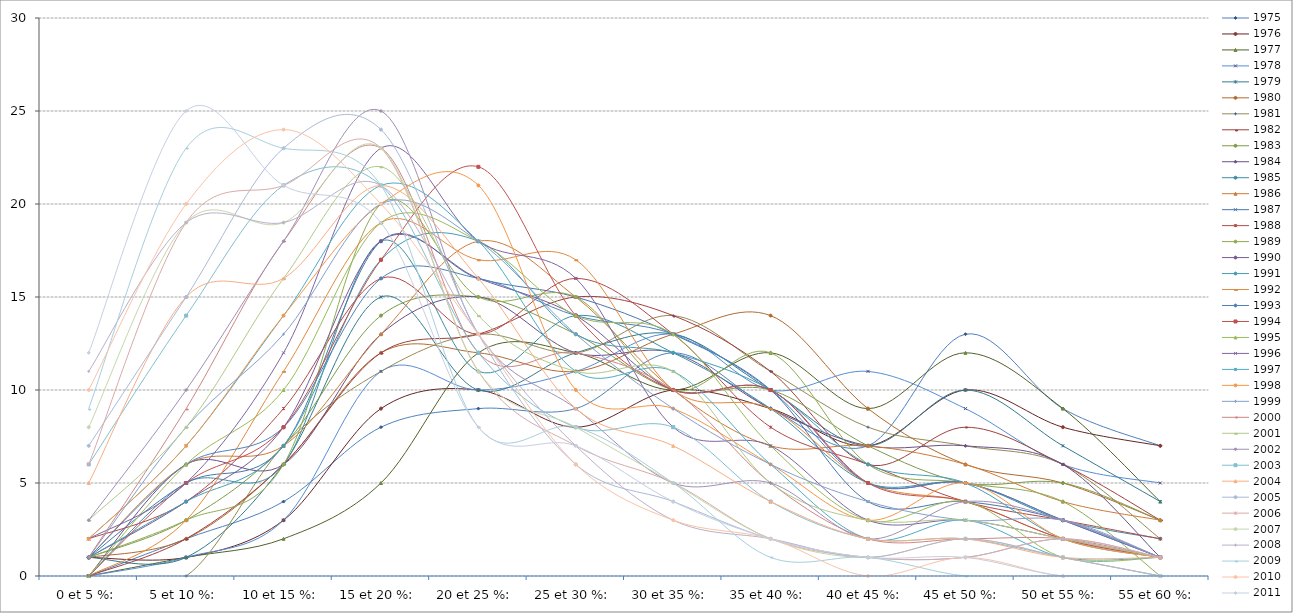
| Category | 1975 | 1976 | 1977 | 1978 | 1979 | 1980 | 1981 | 1982 | 1983 | 1984 | 1985 | 1986 | 1987 | 1988 | 1989 | 1990 | 1991 | 1992 | 1993 | 1994 | 1995 | 1996 | 1997 | 1998 | 1999 | 2000 | 2001 | 2002 | 2003 | 2004 | 2005 | 2006 | 2007 | 2008 | 2009 | 2010 | 2011 |
|---|---|---|---|---|---|---|---|---|---|---|---|---|---|---|---|---|---|---|---|---|---|---|---|---|---|---|---|---|---|---|---|---|---|---|---|---|---|
| 0 et 5 %: | 0 | 1 | 0 | 0 | 1 | 1 | 0 | 0 | 1 | 0 | 0 | 1 | 1 | 2 | 1 | 1 | 1 | 0 | 1 | 0 | 0 | 2 | 2 | 2 | 1 | 1 | 3 | 3 | 6 | 5 | 7 | 6 | 8 | 11 | 9 | 10 | 12 |
| 5 et 10 %: | 2 | 1 | 1 | 1 | 1 | 2 | 0 | 2 | 3 | 6 | 5 | 6 | 5 | 4 | 3 | 4 | 4 | 3 | 6 | 5 | 6 | 5 | 7 | 7 | 8 | 9 | 8 | 10 | 14 | 15 | 15 | 19 | 19 | 19 | 23 | 20 | 25 |
| 10 et 15 %: | 4 | 3 | 2 | 3 | 6 | 6 | 7 | 6 | 7 | 6 | 6 | 7 | 7 | 9 | 6 | 8 | 7 | 11 | 8 | 8 | 10 | 12 | 14 | 14 | 13 | 18 | 16 | 18 | 21 | 16 | 23 | 21 | 19 | 19 | 23 | 24 | 21 |
| 15 et 20 %: | 8 | 9 | 5 | 11 | 15 | 12 | 11 | 12 | 14 | 13 | 18 | 13 | 18 | 16 | 20 | 18 | 17 | 19 | 16 | 17 | 19 | 23 | 21 | 20 | 20 | 23 | 22 | 25 | 21 | 21 | 24 | 23 | 23 | 21 | 21 | 20 | 19 |
| 20 et 25 %: | 9 | 10 | 12 | 10 | 10 | 12 | 13 | 13 | 15 | 15 | 11 | 18 | 16 | 13 | 15 | 16 | 18 | 17 | 16 | 22 | 18 | 18 | 18 | 21 | 18 | 12 | 14 | 13 | 12 | 16 | 13 | 11 | 11 | 13 | 8 | 13 | 8 |
| 25 et 30 %: | 9 | 8 | 12 | 11 | 12 | 11 | 12 | 15 | 13 | 12 | 14 | 15 | 15 | 16 | 15 | 14 | 13 | 17 | 14 | 14 | 14 | 16 | 11 | 10 | 13 | 12 | 11 | 9 | 8 | 9 | 6 | 7 | 8 | 7 | 8 | 6 | 7 |
| 30 et 35 %: | 12 | 10 | 10 | 13 | 13 | 13 | 14 | 14 | 10 | 12 | 12 | 10 | 13 | 13 | 10 | 10 | 12 | 10 | 13 | 10 | 13 | 8 | 11 | 9 | 9 | 10 | 11 | 5 | 8 | 7 | 4 | 5 | 5 | 3 | 5 | 3 | 4 |
| 35 et 40 %: | 9 | 9 | 12 | 10 | 10 | 14 | 11 | 11 | 10 | 9 | 9 | 7 | 10 | 8 | 12 | 10 | 10 | 9 | 10 | 10 | 7 | 7 | 6 | 6 | 6 | 5 | 5 | 5 | 4 | 4 | 2 | 2 | 2 | 2 | 1 | 2 | 2 |
| 40 et 45 %: | 7 | 7 | 9 | 11 | 7 | 9 | 8 | 6 | 7 | 7 | 5 | 7 | 4 | 6 | 6 | 5 | 6 | 5 | 5 | 5 | 3 | 3 | 2 | 3 | 4 | 2 | 3 | 2 | 2 | 2 | 1 | 1 | 1 | 1 | 1 | 0 | 1 |
| 45 et 50 %: | 13 | 10 | 12 | 9 | 10 | 6 | 7 | 8 | 5 | 7 | 5 | 6 | 4 | 4 | 5 | 5 | 5 | 4 | 5 | 4 | 4 | 3 | 3 | 5 | 3 | 2 | 3 | 4 | 2 | 2 | 1 | 1 | 2 | 2 | 0 | 1 | 1 |
| 50 et 55 %: | 9 | 8 | 9 | 6 | 7 | 5 | 6 | 6 | 5 | 6 | 3 | 4 | 3 | 3 | 4 | 3 | 2 | 2 | 3 | 2 | 1 | 2 | 1 | 2 | 3 | 2 | 2 | 3 | 1 | 1 | 2 | 2 | 1 | 1 | 0 | 0 | 0 |
| 55 et 60 %: | 7 | 7 | 4 | 5 | 4 | 3 | 2 | 3 | 3 | 1 | 2 | 3 | 1 | 2 | 0 | 1 | 1 | 1 | 1 | 1 | 1 | 1 | 1 | 1 | 1 | 1 | 1 | 1 | 0 | 1 | 1 | 1 | 0 | 0 | 0 | 0 | 0 |